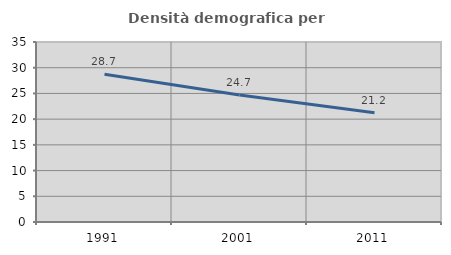
| Category | Densità demografica |
|---|---|
| 1991.0 | 28.72 |
| 2001.0 | 24.694 |
| 2011.0 | 21.222 |